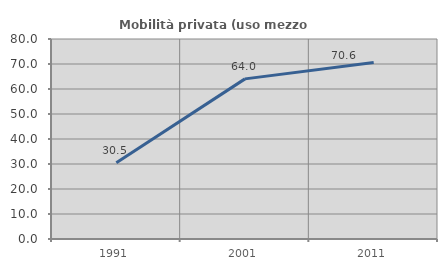
| Category | Mobilità privata (uso mezzo privato) |
|---|---|
| 1991.0 | 30.485 |
| 2001.0 | 64.048 |
| 2011.0 | 70.633 |